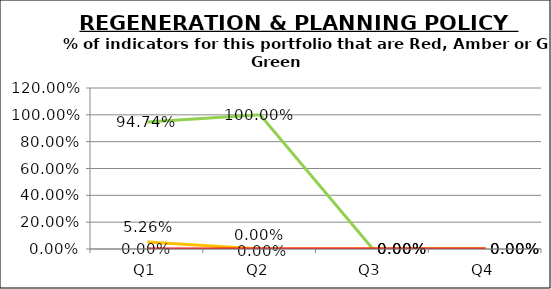
| Category | Green | Amber | Red |
|---|---|---|---|
| Q1 | 0.947 | 0.053 | 0 |
| Q2 | 1 | 0 | 0 |
| Q3 | 0 | 0 | 0 |
| Q4 | 0 | 0 | 0 |